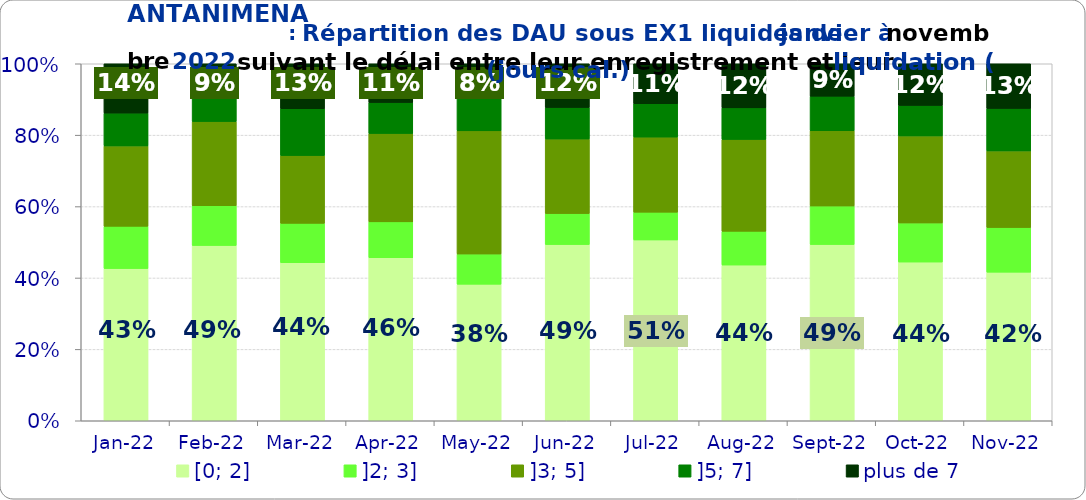
| Category | [0; 2] | ]2; 3] | ]3; 5] | ]5; 7] | plus de 7 |
|---|---|---|---|---|---|
| 2022-01-01 | 0.426 | 0.118 | 0.225 | 0.092 | 0.138 |
| 2022-02-01 | 0.491 | 0.111 | 0.236 | 0.074 | 0.088 |
| 2022-03-01 | 0.443 | 0.11 | 0.19 | 0.131 | 0.126 |
| 2022-04-01 | 0.457 | 0.1 | 0.248 | 0.087 | 0.109 |
| 2022-05-01 | 0.382 | 0.085 | 0.345 | 0.108 | 0.08 |
| 2022-06-01 | 0.494 | 0.087 | 0.209 | 0.088 | 0.123 |
| 2022-07-01 | 0.506 | 0.078 | 0.21 | 0.094 | 0.112 |
| 2022-08-01 | 0.436 | 0.095 | 0.257 | 0.088 | 0.124 |
| 2022-09-01 | 0.494 | 0.108 | 0.211 | 0.097 | 0.091 |
| 2022-10-01 | 0.445 | 0.11 | 0.244 | 0.086 | 0.117 |
| 2022-11-01 | 0.416 | 0.125 | 0.215 | 0.119 | 0.125 |